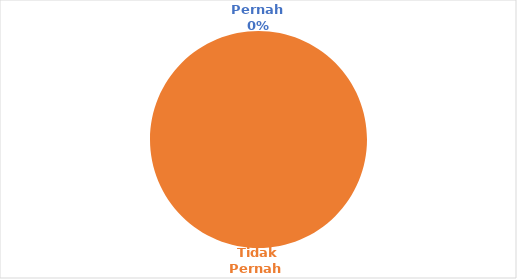
| Category | 2. Setempat |
|---|---|
| Pernah  | 0 |
| Tidak Pernah  | 40 |